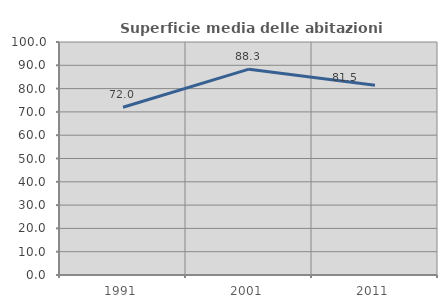
| Category | Superficie media delle abitazioni occupate |
|---|---|
| 1991.0 | 72.021 |
| 2001.0 | 88.344 |
| 2011.0 | 81.477 |